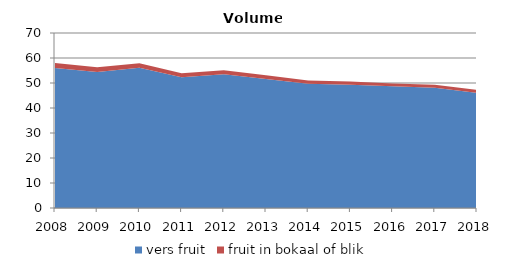
| Category | vers fruit | fruit in bokaal of blik |
|---|---|---|
| 2008.0 | 55.97 | 2.032 |
| 2009.0 | 54.45 | 1.831 |
| 2010.0 | 56.08 | 1.794 |
| 2011.0 | 52.3 | 1.623 |
| 2012.0 | 53.46 | 1.621 |
| 2013.0 | 51.62 | 1.489 |
| 2014.0 | 49.669 | 1.347 |
| 2015.0 | 49.339 | 1.244 |
| 2016.0 | 48.667 | 1.166 |
| 2017.0 | 48.083 | 1.175 |
| 2018.0 | 46.097 | 1.205 |